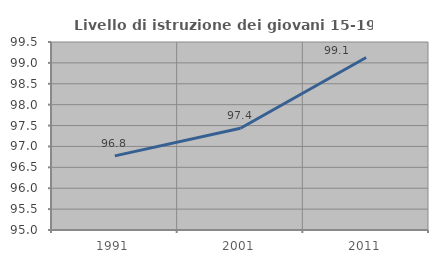
| Category | Livello di istruzione dei giovani 15-19 anni |
|---|---|
| 1991.0 | 96.774 |
| 2001.0 | 97.436 |
| 2011.0 | 99.13 |